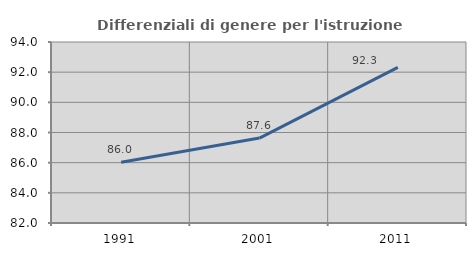
| Category | Differenziali di genere per l'istruzione superiore |
|---|---|
| 1991.0 | 86.031 |
| 2001.0 | 87.629 |
| 2011.0 | 92.319 |